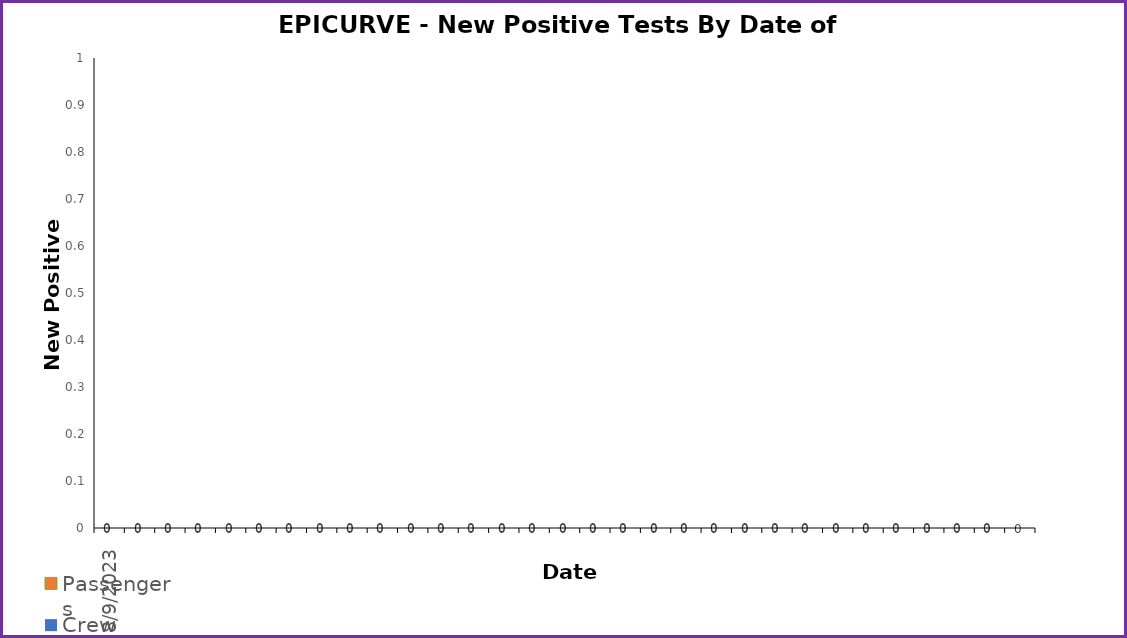
| Category | Crew | Passengers |
|---|---|---|
| 9/08/2023 | 0 | 0 |